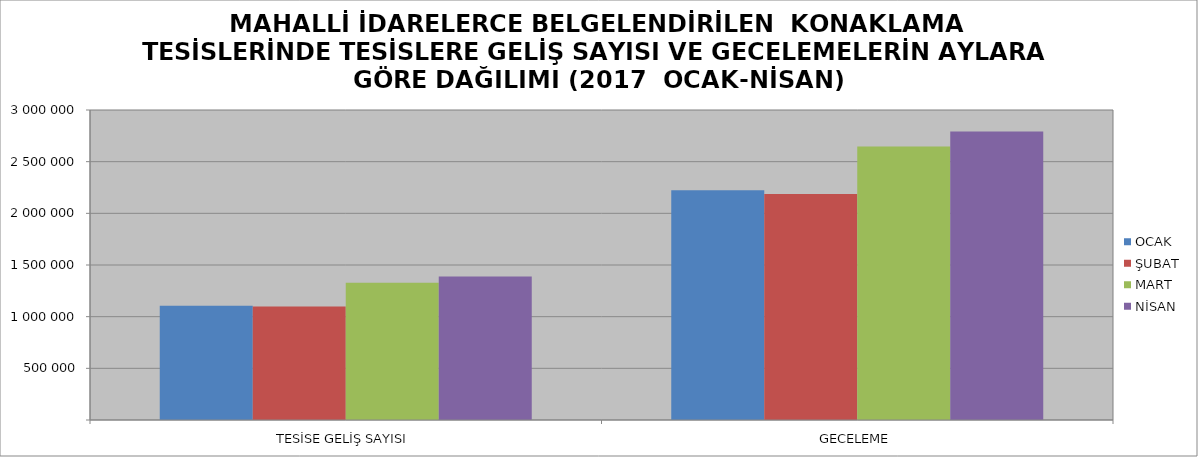
| Category | OCAK | ŞUBAT | MART | NİSAN |
|---|---|---|---|---|
| TESİSE GELİŞ SAYISI | 1104649 | 1099366 | 1327993 | 1389075 |
| GECELEME | 2222261 | 2187982 | 2645959 | 2791881 |